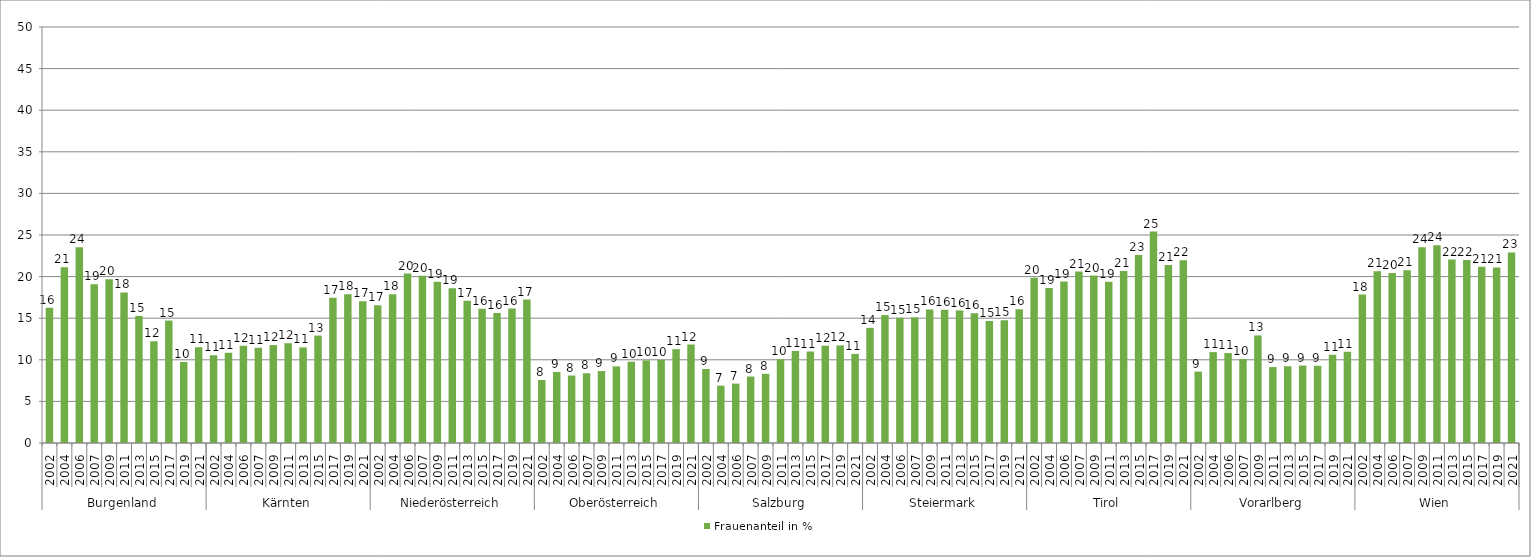
| Category | Frauenanteil in % |
|---|---|
| 0 | 16.257 |
| 1 | 21.126 |
| 2 | 23.514 |
| 3 | 19.083 |
| 4 | 19.684 |
| 5 | 18.096 |
| 6 | 15.275 |
| 7 | 12.231 |
| 8 | 14.71 |
| 9 | 9.741 |
| 10 | 11.496 |
| 11 | 10.541 |
| 12 | 10.842 |
| 13 | 11.675 |
| 14 | 11.445 |
| 15 | 11.772 |
| 16 | 11.992 |
| 17 | 11.493 |
| 18 | 12.909 |
| 19 | 17.446 |
| 20 | 17.877 |
| 21 | 17.029 |
| 22 | 16.567 |
| 23 | 17.867 |
| 24 | 20.366 |
| 25 | 20.115 |
| 26 | 19.383 |
| 27 | 18.59 |
| 28 | 17.084 |
| 29 | 16.144 |
| 30 | 15.633 |
| 31 | 16.165 |
| 32 | 17.237 |
| 33 | 7.577 |
| 34 | 8.541 |
| 35 | 8.104 |
| 36 | 8.378 |
| 37 | 8.643 |
| 38 | 9.205 |
| 39 | 9.768 |
| 40 | 9.927 |
| 41 | 10.004 |
| 42 | 11.279 |
| 43 | 11.839 |
| 44 | 8.893 |
| 45 | 6.889 |
| 46 | 7.14 |
| 47 | 7.988 |
| 48 | 8.322 |
| 49 | 10.068 |
| 50 | 11.067 |
| 51 | 10.987 |
| 52 | 11.693 |
| 53 | 11.731 |
| 54 | 10.707 |
| 55 | 13.841 |
| 56 | 15.373 |
| 57 | 15.053 |
| 58 | 15.098 |
| 59 | 16.057 |
| 60 | 16.006 |
| 61 | 15.925 |
| 62 | 15.607 |
| 63 | 14.659 |
| 64 | 14.764 |
| 65 | 16.079 |
| 66 | 19.867 |
| 67 | 18.633 |
| 68 | 19.409 |
| 69 | 20.612 |
| 70 | 20.13 |
| 71 | 19.381 |
| 72 | 20.661 |
| 73 | 22.592 |
| 74 | 25.415 |
| 75 | 21.404 |
| 76 | 21.973 |
| 77 | 8.577 |
| 78 | 10.925 |
| 79 | 10.81 |
| 80 | 10.095 |
| 81 | 12.931 |
| 82 | 9.123 |
| 83 | 9.23 |
| 84 | 9.306 |
| 85 | 9.281 |
| 86 | 10.595 |
| 87 | 10.961 |
| 88 | 17.837 |
| 89 | 20.645 |
| 90 | 20.435 |
| 91 | 20.773 |
| 92 | 23.514 |
| 93 | 23.762 |
| 94 | 22.053 |
| 95 | 21.981 |
| 96 | 21.183 |
| 97 | 21.1 |
| 98 | 22.899 |